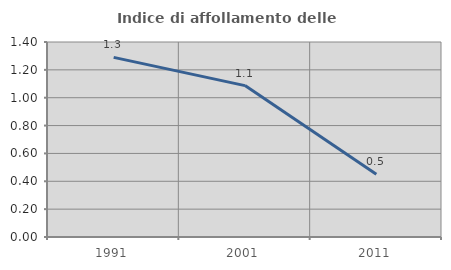
| Category | Indice di affollamento delle abitazioni  |
|---|---|
| 1991.0 | 1.289 |
| 2001.0 | 1.087 |
| 2011.0 | 0.451 |